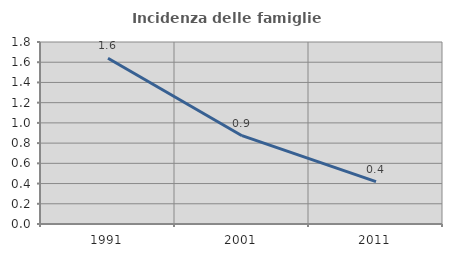
| Category | Incidenza delle famiglie numerose |
|---|---|
| 1991.0 | 1.639 |
| 2001.0 | 0.873 |
| 2011.0 | 0.418 |